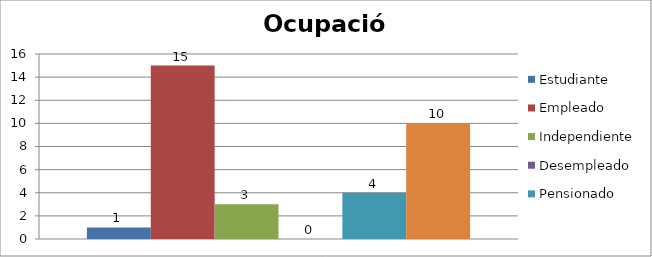
| Category | Estudiante | Empleado | Independiente | Desempleado  | Pensionado | Ama de casa |
|---|---|---|---|---|---|---|
| 0 | 1 | 15 | 3 | 0 | 4 | 10 |